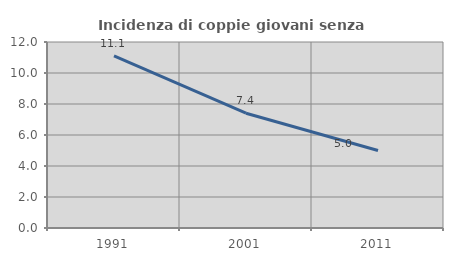
| Category | Incidenza di coppie giovani senza figli |
|---|---|
| 1991.0 | 11.111 |
| 2001.0 | 7.407 |
| 2011.0 | 5 |